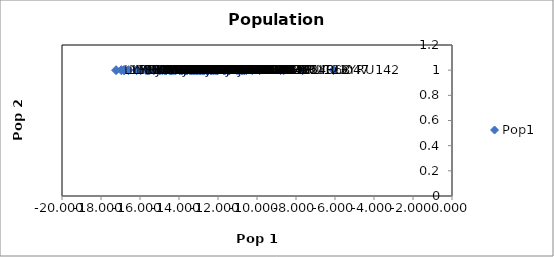
| Category | Pop1 |
|---|---|
| -14.42751766331335 | 1 |
| -15.68537293579753 | 1 |
| -11.406268349250473 | 1 |
| -15.589639237174621 | 1 |
| -12.013242342750063 | 1 |
| -14.204529477279758 | 1 |
| -13.040581200275994 | 1 |
| -15.61093435539572 | 1 |
| -14.75201433960837 | 1 |
| -11.705877967984978 | 1 |
| -13.124033086226618 | 1 |
| -16.175437845126726 | 1 |
| -11.499980027361138 | 1 |
| -13.376341117195112 | 1 |
| -13.957126327777393 | 1 |
| -12.492344044159378 | 1 |
| -16.81327550806552 | 1 |
| -13.71305533987713 | 1 |
| -14.304651888148115 | 1 |
| -13.350468094411212 | 1 |
| -13.33662646674014 | 1 |
| -12.894244375177951 | 1 |
| -13.879430536624326 | 1 |
| -16.59098651986866 | 1 |
| -12.706273450186774 | 1 |
| -13.969061890831034 | 1 |
| -14.85803873150204 | 1 |
| -9.866837723053994 | 1 |
| -12.061067288947894 | 1 |
| -12.337685886953702 | 1 |
| -11.42353469378756 | 1 |
| -11.465119297053706 | 1 |
| -10.928372559743186 | 1 |
| -12.746874976864689 | 1 |
| -12.820239604764737 | 1 |
| -13.26209434200972 | 1 |
| -13.589863414379042 | 1 |
| -13.62655174490822 | 1 |
| -13.822032478327543 | 1 |
| -14.168184558855694 | 1 |
| -15.969679818261966 | 1 |
| -11.426915464637755 | 1 |
| -15.011724094151438 | 1 |
| -10.65847196087273 | 1 |
| -13.05588495454532 | 1 |
| -7.659017283802015 | 1 |
| -12.583507320627449 | 1 |
| -13.65596320409507 | 1 |
| -16.957762394796838 | 1 |
| -15.290360169880927 | 1 |
| -8.628464285825025 | 1 |
| -12.956070722864883 | 1 |
| -12.025286812221877 | 1 |
| -14.681461275420533 | 1 |
| -10.764319145439579 | 1 |
| -13.383277778274183 | 1 |
| -12.20975254399062 | 1 |
| -10.771079013814095 | 1 |
| -17.226063850769606 | 1 |
| -13.362570173610454 | 1 |
| -13.055030007098617 | 1 |
| -13.641105976860953 | 1 |
| -16.815121172891534 | 1 |
| -15.595613828793475 | 1 |
| -11.67699607085518 | 1 |
| -12.1117296821074 | 1 |
| -14.99287909742225 | 1 |
| -12.25392697998991 | 1 |
| -13.12233459406055 | 1 |
| -14.488303020621592 | 1 |
| -13.584103308399095 | 1 |
| -12.914514774694254 | 1 |
| -11.683658888076156 | 1 |
| -11.630011781977423 | 1 |
| -11.408781165368293 | 1 |
| -13.675921847702435 | 1 |
| -13.047452166087497 | 1 |
| -12.762359275706848 | 1 |
| -14.387025958254146 | 1 |
| -12.591417285772323 | 1 |
| -13.213027934145668 | 1 |
| -10.55396179591645 | 1 |
| -12.372873427292715 | 1 |
| -12.514166204072401 | 1 |
| -8.789750301479543 | 1 |
| -12.699431792556071 | 1 |
| -13.43572907135873 | 1 |
| -11.44855508672063 | 1 |
| -14.68159484349088 | 1 |
| -13.356494517965631 | 1 |
| -12.913824879573845 | 1 |
| -14.664193184768962 | 1 |
| -10.240081480948787 | 1 |
| -14.367984919378893 | 1 |
| -10.653756825786965 | 1 |
| -13.870500043974596 | 1 |
| -11.027449809409005 | 1 |
| -6.0778640986870895 | 1 |
| -15.523790420469664 | 1 |
| -14.651745765711233 | 1 |
| -12.368484253172658 | 1 |
| -14.969320598549116 | 1 |